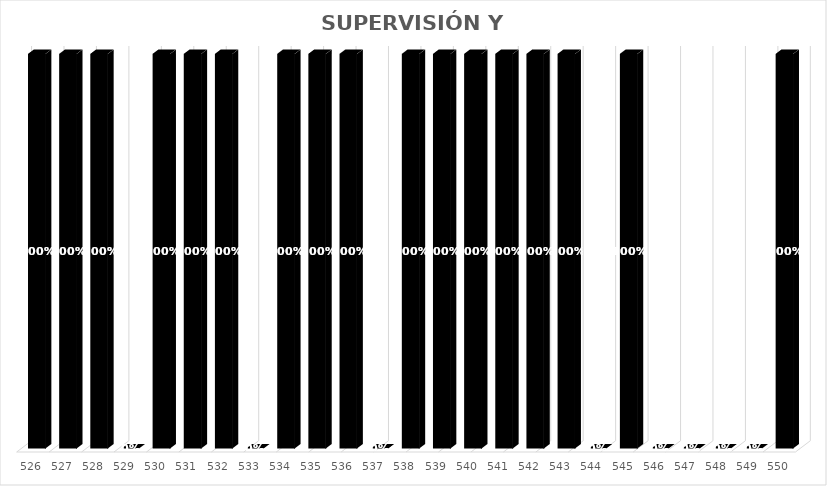
| Category | % Avance |
|---|---|
| 526.0 | 1 |
| 527.0 | 1 |
| 528.0 | 1 |
| 529.0 | 0 |
| 530.0 | 1 |
| 531.0 | 1 |
| 532.0 | 1 |
| 533.0 | 0 |
| 534.0 | 1 |
| 535.0 | 1 |
| 536.0 | 1 |
| 537.0 | 0 |
| 538.0 | 1 |
| 539.0 | 1 |
| 540.0 | 1 |
| 541.0 | 1 |
| 542.0 | 1 |
| 543.0 | 1 |
| 544.0 | 0 |
| 545.0 | 1 |
| 546.0 | 0 |
| 547.0 | 0 |
| 548.0 | 0 |
| 549.0 | 0 |
| 550.0 | 1 |